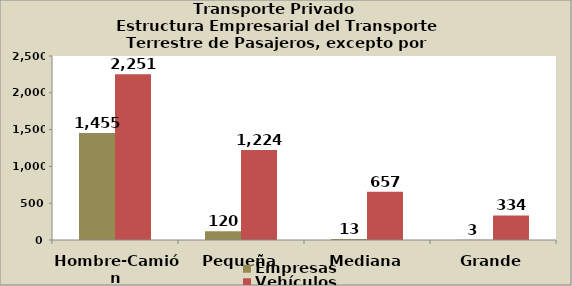
| Category | Empresas | Vehículos |
|---|---|---|
| Hombre-Camión | 1455 | 2251 |
| Pequeña | 120 | 1224 |
| Mediana | 13 | 657 |
| Grande | 3 | 334 |